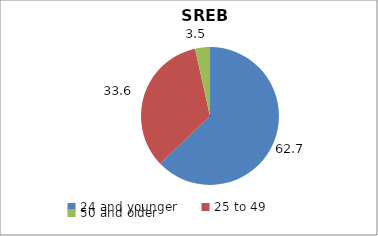
| Category | Series 0 | Series 1 |
|---|---|---|
| 24 and younger | 62.728 | 62.728 |
| 25 to 49 | 33.57 | 33.57 |
| 50 and older | 3.482 | 3.482 |